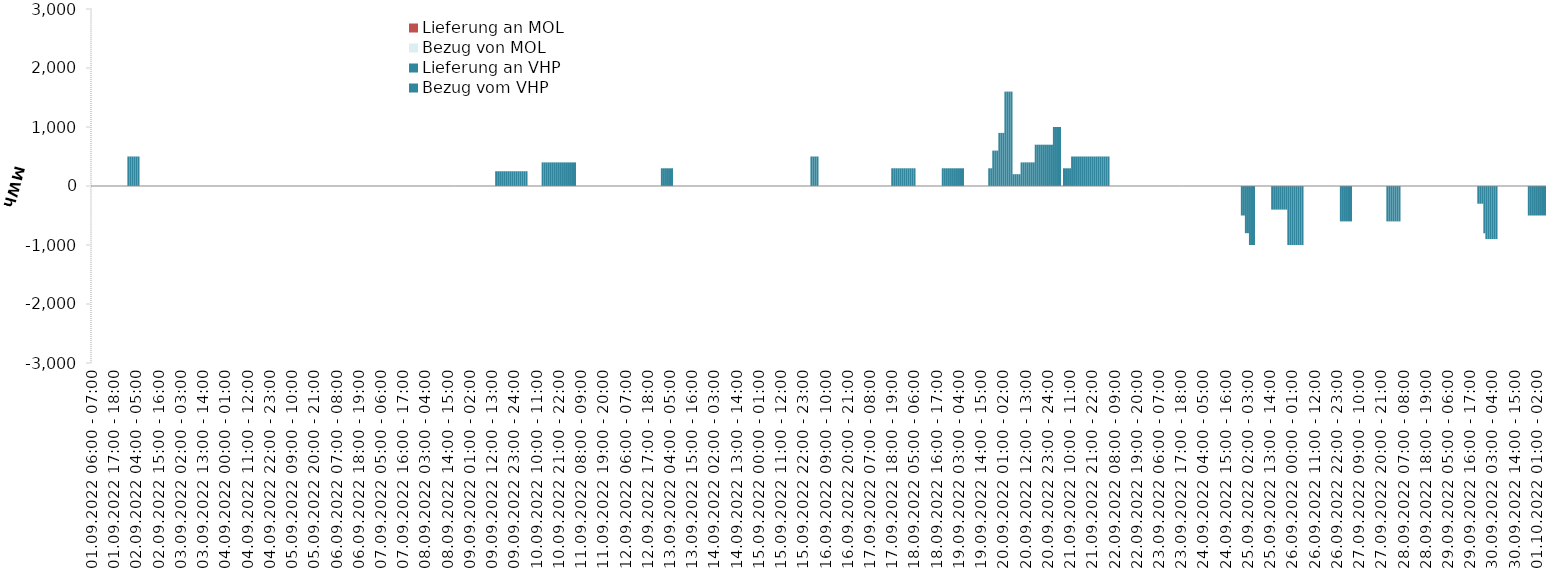
| Category | Bezug vom VHP | Lieferung an VHP | Bezug von MOL | Lieferung an MOL |
|---|---|---|---|---|
| 01.09.2022 06:00 - 07:00 | 0 | 0 | 0 | 0 |
| 01.09.2022 07:00 - 08:00 | 0 | 0 | 0 | 0 |
| 01.09.2022 08:00 - 09:00 | 0 | 0 | 0 | 0 |
| 01.09.2022 09:00 - 10:00 | 0 | 0 | 0 | 0 |
| 01.09.2022 10:00 - 11:00 | 0 | 0 | 0 | 0 |
| 01.09.2022 11:00 - 12:00 | 0 | 0 | 0 | 0 |
| 01.09.2022 12:00 - 13:00 | 0 | 0 | 0 | 0 |
| 01.09.2022 13:00 - 14:00 | 0 | 0 | 0 | 0 |
| 01.09.2022 14:00 - 15:00 | 0 | 0 | 0 | 0 |
| 01.09.2022 15:00 - 16:00 | 0 | 0 | 0 | 0 |
| 01.09.2022 16:00 - 17:00 | 0 | 0 | 0 | 0 |
| 01.09.2022 17:00 - 18:00 | 0 | 0 | 0 | 0 |
| 01.09.2022 18:00 - 19:00 | 0 | 0 | 0 | 0 |
| 01.09.2022 19:00 - 20:00 | 0 | 0 | 0 | 0 |
| 01.09.2022 20:00 - 21:00 | 0 | 0 | 0 | 0 |
| 01.09.2022 21:00 - 22:00 | 0 | 0 | 0 | 0 |
| 01.09.2022 22:00 - 23:00 | 0 | 0 | 0 | 0 |
| 01.09.2022 23:00 - 24:00 | 0 | 0 | 0 | 0 |
| 02.09.2022 00:00 - 01:00 | 500 | 0 | 0 | 0 |
| 02.09.2022 01:00 - 02:00 | 500 | 0 | 0 | 0 |
| 02.09.2022 02:00 - 03:00 | 500 | 0 | 0 | 0 |
| 02.09.2022 03:00 - 04:00 | 500 | 0 | 0 | 0 |
| 02.09.2022 04:00 - 05:00 | 500 | 0 | 0 | 0 |
| 02.09.2022 05:00 - 06:00 | 500 | 0 | 0 | 0 |
| 02.09.2022 06:00 - 07:00 | 0 | 0 | 0 | 0 |
| 02.09.2022 07:00 - 08:00 | 0 | 0 | 0 | 0 |
| 02.09.2022 08:00 - 09:00 | 0 | 0 | 0 | 0 |
| 02.09.2022 09:00 - 10:00 | 0 | 0 | 0 | 0 |
| 02.09.2022 10:00 - 11:00 | 0 | 0 | 0 | 0 |
| 02.09.2022 11:00 - 12:00 | 0 | 0 | 0 | 0 |
| 02.09.2022 12:00 - 13:00 | 0 | 0 | 0 | 0 |
| 02.09.2022 13:00 - 14:00 | 0 | 0 | 0 | 0 |
| 02.09.2022 14:00 - 15:00 | 0 | 0 | 0 | 0 |
| 02.09.2022 15:00 - 16:00 | 0 | 0 | 0 | 0 |
| 02.09.2022 16:00 - 17:00 | 0 | 0 | 0 | 0 |
| 02.09.2022 17:00 - 18:00 | 0 | 0 | 0 | 0 |
| 02.09.2022 18:00 - 19:00 | 0 | 0 | 0 | 0 |
| 02.09.2022 19:00 - 20:00 | 0 | 0 | 0 | 0 |
| 02.09.2022 20:00 - 21:00 | 0 | 0 | 0 | 0 |
| 02.09.2022 21:00 - 22:00 | 0 | 0 | 0 | 0 |
| 02.09.2022 22:00 - 23:00 | 0 | 0 | 0 | 0 |
| 02.09.2022 23:00 - 24:00 | 0 | 0 | 0 | 0 |
| 03.09.2022 00:00 - 01:00 | 0 | 0 | 0 | 0 |
| 03.09.2022 01:00 - 02:00 | 0 | 0 | 0 | 0 |
| 03.09.2022 02:00 - 03:00 | 0 | 0 | 0 | 0 |
| 03.09.2022 03:00 - 04:00 | 0 | 0 | 0 | 0 |
| 03.09.2022 04:00 - 05:00 | 0 | 0 | 0 | 0 |
| 03.09.2022 05:00 - 06:00 | 0 | 0 | 0 | 0 |
| 03.09.2022 06:00 - 07:00 | 0 | 0 | 0 | 0 |
| 03.09.2022 07:00 - 08:00 | 0 | 0 | 0 | 0 |
| 03.09.2022 08:00 - 09:00 | 0 | 0 | 0 | 0 |
| 03.09.2022 09:00 - 10:00 | 0 | 0 | 0 | 0 |
| 03.09.2022 10:00 - 11:00 | 0 | 0 | 0 | 0 |
| 03.09.2022 11:00 - 12:00 | 0 | 0 | 0 | 0 |
| 03.09.2022 12:00 - 13:00 | 0 | 0 | 0 | 0 |
| 03.09.2022 13:00 - 14:00 | 0 | 0 | 0 | 0 |
| 03.09.2022 14:00 - 15:00 | 0 | 0 | 0 | 0 |
| 03.09.2022 15:00 - 16:00 | 0 | 0 | 0 | 0 |
| 03.09.2022 16:00 - 17:00 | 0 | 0 | 0 | 0 |
| 03.09.2022 17:00 - 18:00 | 0 | 0 | 0 | 0 |
| 03.09.2022 18:00 - 19:00 | 0 | 0 | 0 | 0 |
| 03.09.2022 19:00 - 20:00 | 0 | 0 | 0 | 0 |
| 03.09.2022 20:00 - 21:00 | 0 | 0 | 0 | 0 |
| 03.09.2022 21:00 - 22:00 | 0 | 0 | 0 | 0 |
| 03.09.2022 22:00 - 23:00 | 0 | 0 | 0 | 0 |
| 03.09.2022 23:00 - 24:00 | 0 | 0 | 0 | 0 |
| 04.09.2022 00:00 - 01:00 | 0 | 0 | 0 | 0 |
| 04.09.2022 01:00 - 02:00 | 0 | 0 | 0 | 0 |
| 04.09.2022 02:00 - 03:00 | 0 | 0 | 0 | 0 |
| 04.09.2022 03:00 - 04:00 | 0 | 0 | 0 | 0 |
| 04.09.2022 04:00 - 05:00 | 0 | 0 | 0 | 0 |
| 04.09.2022 05:00 - 06:00 | 0 | 0 | 0 | 0 |
| 04.09.2022 06:00 - 07:00 | 0 | 0 | 0 | 0 |
| 04.09.2022 07:00 - 08:00 | 0 | 0 | 0 | 0 |
| 04.09.2022 08:00 - 09:00 | 0 | 0 | 0 | 0 |
| 04.09.2022 09:00 - 10:00 | 0 | 0 | 0 | 0 |
| 04.09.2022 10:00 - 11:00 | 0 | 0 | 0 | 0 |
| 04.09.2022 11:00 - 12:00 | 0 | 0 | 0 | 0 |
| 04.09.2022 12:00 - 13:00 | 0 | 0 | 0 | 0 |
| 04.09.2022 13:00 - 14:00 | 0 | 0 | 0 | 0 |
| 04.09.2022 14:00 - 15:00 | 0 | 0 | 0 | 0 |
| 04.09.2022 15:00 - 16:00 | 0 | 0 | 0 | 0 |
| 04.09.2022 16:00 - 17:00 | 0 | 0 | 0 | 0 |
| 04.09.2022 17:00 - 18:00 | 0 | 0 | 0 | 0 |
| 04.09.2022 18:00 - 19:00 | 0 | 0 | 0 | 0 |
| 04.09.2022 19:00 - 20:00 | 0 | 0 | 0 | 0 |
| 04.09.2022 20:00 - 21:00 | 0 | 0 | 0 | 0 |
| 04.09.2022 21:00 - 22:00 | 0 | 0 | 0 | 0 |
| 04.09.2022 22:00 - 23:00 | 0 | 0 | 0 | 0 |
| 04.09.2022 23:00 - 24:00 | 0 | 0 | 0 | 0 |
| 05.09.2022 00:00 - 01:00 | 0 | 0 | 0 | 0 |
| 05.09.2022 01:00 - 02:00 | 0 | 0 | 0 | 0 |
| 05.09.2022 02:00 - 03:00 | 0 | 0 | 0 | 0 |
| 05.09.2022 03:00 - 04:00 | 0 | 0 | 0 | 0 |
| 05.09.2022 04:00 - 05:00 | 0 | 0 | 0 | 0 |
| 05.09.2022 05:00 - 06:00 | 0 | 0 | 0 | 0 |
| 05.09.2022 06:00 - 07:00 | 0 | 0 | 0 | 0 |
| 05.09.2022 07:00 - 08:00 | 0 | 0 | 0 | 0 |
| 05.09.2022 08:00 - 09:00 | 0 | 0 | 0 | 0 |
| 05.09.2022 09:00 - 10:00 | 0 | 0 | 0 | 0 |
| 05.09.2022 10:00 - 11:00 | 0 | 0 | 0 | 0 |
| 05.09.2022 11:00 - 12:00 | 0 | 0 | 0 | 0 |
| 05.09.2022 12:00 - 13:00 | 0 | 0 | 0 | 0 |
| 05.09.2022 13:00 - 14:00 | 0 | 0 | 0 | 0 |
| 05.09.2022 14:00 - 15:00 | 0 | 0 | 0 | 0 |
| 05.09.2022 15:00 - 16:00 | 0 | 0 | 0 | 0 |
| 05.09.2022 16:00 - 17:00 | 0 | 0 | 0 | 0 |
| 05.09.2022 17:00 - 18:00 | 0 | 0 | 0 | 0 |
| 05.09.2022 18:00 - 19:00 | 0 | 0 | 0 | 0 |
| 05.09.2022 19:00 - 20:00 | 0 | 0 | 0 | 0 |
| 05.09.2022 20:00 - 21:00 | 0 | 0 | 0 | 0 |
| 05.09.2022 21:00 - 22:00 | 0 | 0 | 0 | 0 |
| 05.09.2022 22:00 - 23:00 | 0 | 0 | 0 | 0 |
| 05.09.2022 23:00 - 24:00 | 0 | 0 | 0 | 0 |
| 06.09.2022 00:00 - 01:00 | 0 | 0 | 0 | 0 |
| 06.09.2022 01:00 - 02:00 | 0 | 0 | 0 | 0 |
| 06.09.2022 02:00 - 03:00 | 0 | 0 | 0 | 0 |
| 06.09.2022 03:00 - 04:00 | 0 | 0 | 0 | 0 |
| 06.09.2022 04:00 - 05:00 | 0 | 0 | 0 | 0 |
| 06.09.2022 05:00 - 06:00 | 0 | 0 | 0 | 0 |
| 06.09.2022 06:00 - 07:00 | 0 | 0 | 0 | 0 |
| 06.09.2022 07:00 - 08:00 | 0 | 0 | 0 | 0 |
| 06.09.2022 08:00 - 09:00 | 0 | 0 | 0 | 0 |
| 06.09.2022 09:00 - 10:00 | 0 | 0 | 0 | 0 |
| 06.09.2022 10:00 - 11:00 | 0 | 0 | 0 | 0 |
| 06.09.2022 11:00 - 12:00 | 0 | 0 | 0 | 0 |
| 06.09.2022 12:00 - 13:00 | 0 | 0 | 0 | 0 |
| 06.09.2022 13:00 - 14:00 | 0 | 0 | 0 | 0 |
| 06.09.2022 14:00 - 15:00 | 0 | 0 | 0 | 0 |
| 06.09.2022 15:00 - 16:00 | 0 | 0 | 0 | 0 |
| 06.09.2022 16:00 - 17:00 | 0 | 0 | 0 | 0 |
| 06.09.2022 17:00 - 18:00 | 0 | 0 | 0 | 0 |
| 06.09.2022 18:00 - 19:00 | 0 | 0 | 0 | 0 |
| 06.09.2022 19:00 - 20:00 | 0 | 0 | 0 | 0 |
| 06.09.2022 20:00 - 21:00 | 0 | 0 | 0 | 0 |
| 06.09.2022 21:00 - 22:00 | 0 | 0 | 0 | 0 |
| 06.09.2022 22:00 - 23:00 | 0 | 0 | 0 | 0 |
| 06.09.2022 23:00 - 24:00 | 0 | 0 | 0 | 0 |
| 07.09.2022 00:00 - 01:00 | 0 | 0 | 0 | 0 |
| 07.09.2022 01:00 - 02:00 | 0 | 0 | 0 | 0 |
| 07.09.2022 02:00 - 03:00 | 0 | 0 | 0 | 0 |
| 07.09.2022 03:00 - 04:00 | 0 | 0 | 0 | 0 |
| 07.09.2022 04:00 - 05:00 | 0 | 0 | 0 | 0 |
| 07.09.2022 05:00 - 06:00 | 0 | 0 | 0 | 0 |
| 07.09.2022 06:00 - 07:00 | 0 | 0 | 0 | 0 |
| 07.09.2022 07:00 - 08:00 | 0 | 0 | 0 | 0 |
| 07.09.2022 08:00 - 09:00 | 0 | 0 | 0 | 0 |
| 07.09.2022 09:00 - 10:00 | 0 | 0 | 0 | 0 |
| 07.09.2022 10:00 - 11:00 | 0 | 0 | 0 | 0 |
| 07.09.2022 11:00 - 12:00 | 0 | 0 | 0 | 0 |
| 07.09.2022 12:00 - 13:00 | 0 | 0 | 0 | 0 |
| 07.09.2022 13:00 - 14:00 | 0 | 0 | 0 | 0 |
| 07.09.2022 14:00 - 15:00 | 0 | 0 | 0 | 0 |
| 07.09.2022 15:00 - 16:00 | 0 | 0 | 0 | 0 |
| 07.09.2022 16:00 - 17:00 | 0 | 0 | 0 | 0 |
| 07.09.2022 17:00 - 18:00 | 0 | 0 | 0 | 0 |
| 07.09.2022 18:00 - 19:00 | 0 | 0 | 0 | 0 |
| 07.09.2022 19:00 - 20:00 | 0 | 0 | 0 | 0 |
| 07.09.2022 20:00 - 21:00 | 0 | 0 | 0 | 0 |
| 07.09.2022 21:00 - 22:00 | 0 | 0 | 0 | 0 |
| 07.09.2022 22:00 - 23:00 | 0 | 0 | 0 | 0 |
| 07.09.2022 23:00 - 24:00 | 0 | 0 | 0 | 0 |
| 08.09.2022 00:00 - 01:00 | 0 | 0 | 0 | 0 |
| 08.09.2022 01:00 - 02:00 | 0 | 0 | 0 | 0 |
| 08.09.2022 02:00 - 03:00 | 0 | 0 | 0 | 0 |
| 08.09.2022 03:00 - 04:00 | 0 | 0 | 0 | 0 |
| 08.09.2022 04:00 - 05:00 | 0 | 0 | 0 | 0 |
| 08.09.2022 05:00 - 06:00 | 0 | 0 | 0 | 0 |
| 08.09.2022 06:00 - 07:00 | 0 | 0 | 0 | 0 |
| 08.09.2022 07:00 - 08:00 | 0 | 0 | 0 | 0 |
| 08.09.2022 08:00 - 09:00 | 0 | 0 | 0 | 0 |
| 08.09.2022 09:00 - 10:00 | 0 | 0 | 0 | 0 |
| 08.09.2022 10:00 - 11:00 | 0 | 0 | 0 | 0 |
| 08.09.2022 11:00 - 12:00 | 0 | 0 | 0 | 0 |
| 08.09.2022 12:00 - 13:00 | 0 | 0 | 0 | 0 |
| 08.09.2022 13:00 - 14:00 | 0 | 0 | 0 | 0 |
| 08.09.2022 14:00 - 15:00 | 0 | 0 | 0 | 0 |
| 08.09.2022 15:00 - 16:00 | 0 | 0 | 0 | 0 |
| 08.09.2022 16:00 - 17:00 | 0 | 0 | 0 | 0 |
| 08.09.2022 17:00 - 18:00 | 0 | 0 | 0 | 0 |
| 08.09.2022 18:00 - 19:00 | 0 | 0 | 0 | 0 |
| 08.09.2022 19:00 - 20:00 | 0 | 0 | 0 | 0 |
| 08.09.2022 20:00 - 21:00 | 0 | 0 | 0 | 0 |
| 08.09.2022 21:00 - 22:00 | 0 | 0 | 0 | 0 |
| 08.09.2022 22:00 - 23:00 | 0 | 0 | 0 | 0 |
| 08.09.2022 23:00 - 24:00 | 0 | 0 | 0 | 0 |
| 09.09.2022 00:00 - 01:00 | 0 | 0 | 0 | 0 |
| 09.09.2022 01:00 - 02:00 | 0 | 0 | 0 | 0 |
| 09.09.2022 02:00 - 03:00 | 0 | 0 | 0 | 0 |
| 09.09.2022 03:00 - 04:00 | 0 | 0 | 0 | 0 |
| 09.09.2022 04:00 - 05:00 | 0 | 0 | 0 | 0 |
| 09.09.2022 05:00 - 06:00 | 0 | 0 | 0 | 0 |
| 09.09.2022 06:00 - 07:00 | 0 | 0 | 0 | 0 |
| 09.09.2022 07:00 - 08:00 | 0 | 0 | 0 | 0 |
| 09.09.2022 08:00 - 09:00 | 0 | 0 | 0 | 0 |
| 09.09.2022 09:00 - 10:00 | 0 | 0 | 0 | 0 |
| 09.09.2022 10:00 - 11:00 | 0 | 0 | 0 | 0 |
| 09.09.2022 11:00 - 12:00 | 0 | 0 | 0 | 0 |
| 09.09.2022 12:00 - 13:00 | 0 | 0 | 0 | 0 |
| 09.09.2022 13:00 - 14:00 | 0 | 0 | 0 | 0 |
| 09.09.2022 14:00 - 15:00 | 250 | 0 | 0 | 0 |
| 09.09.2022 15:00 - 16:00 | 250 | 0 | 0 | 0 |
| 09.09.2022 16:00 - 17:00 | 250 | 0 | 0 | 0 |
| 09.09.2022 17:00 - 18:00 | 250 | 0 | 0 | 0 |
| 09.09.2022 18:00 - 19:00 | 250 | 0 | 0 | 0 |
| 09.09.2022 19:00 - 20:00 | 250 | 0 | 0 | 0 |
| 09.09.2022 20:00 - 21:00 | 250 | 0 | 0 | 0 |
| 09.09.2022 21:00 - 22:00 | 250 | 0 | 0 | 0 |
| 09.09.2022 22:00 - 23:00 | 250 | 0 | 0 | 0 |
| 09.09.2022 23:00 - 24:00 | 250 | 0 | 0 | 0 |
| 10.09.2022 00:00 - 01:00 | 250 | 0 | 0 | 0 |
| 10.09.2022 01:00 - 02:00 | 250 | 0 | 0 | 0 |
| 10.09.2022 02:00 - 03:00 | 250 | 0 | 0 | 0 |
| 10.09.2022 03:00 - 04:00 | 250 | 0 | 0 | 0 |
| 10.09.2022 04:00 - 05:00 | 250 | 0 | 0 | 0 |
| 10.09.2022 05:00 - 06:00 | 250 | 0 | 0 | 0 |
| 10.09.2022 06:00 - 07:00 | 0 | 0 | 0 | 0 |
| 10.09.2022 07:00 - 08:00 | 0 | 0 | 0 | 0 |
| 10.09.2022 08:00 - 09:00 | 0 | 0 | 0 | 0 |
| 10.09.2022 09:00 - 10:00 | 0 | 0 | 0 | 0 |
| 10.09.2022 10:00 - 11:00 | 0 | 0 | 0 | 0 |
| 10.09.2022 11:00 - 12:00 | 0 | 0 | 0 | 0 |
| 10.09.2022 12:00 - 13:00 | 0 | 0 | 0 | 0 |
| 10.09.2022 13:00 - 14:00 | 400 | 0 | 0 | 0 |
| 10.09.2022 14:00 - 15:00 | 400 | 0 | 0 | 0 |
| 10.09.2022 15:00 - 16:00 | 400 | 0 | 0 | 0 |
| 10.09.2022 16:00 - 17:00 | 400 | 0 | 0 | 0 |
| 10.09.2022 17:00 - 18:00 | 400 | 0 | 0 | 0 |
| 10.09.2022 18:00 - 19:00 | 400 | 0 | 0 | 0 |
| 10.09.2022 19:00 - 20:00 | 400 | 0 | 0 | 0 |
| 10.09.2022 20:00 - 21:00 | 400 | 0 | 0 | 0 |
| 10.09.2022 21:00 - 22:00 | 400 | 0 | 0 | 0 |
| 10.09.2022 22:00 - 23:00 | 400 | 0 | 0 | 0 |
| 10.09.2022 23:00 - 24:00 | 400 | 0 | 0 | 0 |
| 11.09.2022 00:00 - 01:00 | 400 | 0 | 0 | 0 |
| 11.09.2022 01:00 - 02:00 | 400 | 0 | 0 | 0 |
| 11.09.2022 02:00 - 03:00 | 400 | 0 | 0 | 0 |
| 11.09.2022 03:00 - 04:00 | 400 | 0 | 0 | 0 |
| 11.09.2022 04:00 - 05:00 | 400 | 0 | 0 | 0 |
| 11.09.2022 05:00 - 06:00 | 400 | 0 | 0 | 0 |
| 11.09.2022 06:00 - 07:00 | 0 | 0 | 0 | 0 |
| 11.09.2022 07:00 - 08:00 | 0 | 0 | 0 | 0 |
| 11.09.2022 08:00 - 09:00 | 0 | 0 | 0 | 0 |
| 11.09.2022 09:00 - 10:00 | 0 | 0 | 0 | 0 |
| 11.09.2022 10:00 - 11:00 | 0 | 0 | 0 | 0 |
| 11.09.2022 11:00 - 12:00 | 0 | 0 | 0 | 0 |
| 11.09.2022 12:00 - 13:00 | 0 | 0 | 0 | 0 |
| 11.09.2022 13:00 - 14:00 | 0 | 0 | 0 | 0 |
| 11.09.2022 14:00 - 15:00 | 0 | 0 | 0 | 0 |
| 11.09.2022 15:00 - 16:00 | 0 | 0 | 0 | 0 |
| 11.09.2022 16:00 - 17:00 | 0 | 0 | 0 | 0 |
| 11.09.2022 17:00 - 18:00 | 0 | 0 | 0 | 0 |
| 11.09.2022 18:00 - 19:00 | 0 | 0 | 0 | 0 |
| 11.09.2022 19:00 - 20:00 | 0 | 0 | 0 | 0 |
| 11.09.2022 20:00 - 21:00 | 0 | 0 | 0 | 0 |
| 11.09.2022 21:00 - 22:00 | 0 | 0 | 0 | 0 |
| 11.09.2022 22:00 - 23:00 | 0 | 0 | 0 | 0 |
| 11.09.2022 23:00 - 24:00 | 0 | 0 | 0 | 0 |
| 12.09.2022 00:00 - 01:00 | 0 | 0 | 0 | 0 |
| 12.09.2022 01:00 - 02:00 | 0 | 0 | 0 | 0 |
| 12.09.2022 02:00 - 03:00 | 0 | 0 | 0 | 0 |
| 12.09.2022 03:00 - 04:00 | 0 | 0 | 0 | 0 |
| 12.09.2022 04:00 - 05:00 | 0 | 0 | 0 | 0 |
| 12.09.2022 05:00 - 06:00 | 0 | 0 | 0 | 0 |
| 12.09.2022 06:00 - 07:00 | 0 | 0 | 0 | 0 |
| 12.09.2022 07:00 - 08:00 | 0 | 0 | 0 | 0 |
| 12.09.2022 08:00 - 09:00 | 0 | 0 | 0 | 0 |
| 12.09.2022 09:00 - 10:00 | 0 | 0 | 0 | 0 |
| 12.09.2022 10:00 - 11:00 | 0 | 0 | 0 | 0 |
| 12.09.2022 11:00 - 12:00 | 0 | 0 | 0 | 0 |
| 12.09.2022 12:00 - 13:00 | 0 | 0 | 0 | 0 |
| 12.09.2022 13:00 - 14:00 | 0 | 0 | 0 | 0 |
| 12.09.2022 14:00 - 15:00 | 0 | 0 | 0 | 0 |
| 12.09.2022 15:00 - 16:00 | 0 | 0 | 0 | 0 |
| 12.09.2022 16:00 - 17:00 | 0 | 0 | 0 | 0 |
| 12.09.2022 17:00 - 18:00 | 0 | 0 | 0 | 0 |
| 12.09.2022 18:00 - 19:00 | 0 | 0 | 0 | 0 |
| 12.09.2022 19:00 - 20:00 | 0 | 0 | 0 | 0 |
| 12.09.2022 20:00 - 21:00 | 0 | 0 | 0 | 0 |
| 12.09.2022 21:00 - 22:00 | 0 | 0 | 0 | 0 |
| 12.09.2022 22:00 - 23:00 | 0 | 0 | 0 | 0 |
| 12.09.2022 23:00 - 24:00 | 0 | 0 | 0 | 0 |
| 13.09.2022 00:00 - 01:00 | 300 | 0 | 0 | 0 |
| 13.09.2022 01:00 - 02:00 | 300 | 0 | 0 | 0 |
| 13.09.2022 02:00 - 03:00 | 300 | 0 | 0 | 0 |
| 13.09.2022 03:00 - 04:00 | 300 | 0 | 0 | 0 |
| 13.09.2022 04:00 - 05:00 | 300 | 0 | 0 | 0 |
| 13.09.2022 05:00 - 06:00 | 300 | 0 | 0 | 0 |
| 13.09.2022 06:00 - 07:00 | 0 | 0 | 0 | 0 |
| 13.09.2022 07:00 - 08:00 | 0 | 0 | 0 | 0 |
| 13.09.2022 08:00 - 09:00 | 0 | 0 | 0 | 0 |
| 13.09.2022 09:00 - 10:00 | 0 | 0 | 0 | 0 |
| 13.09.2022 10:00 - 11:00 | 0 | 0 | 0 | 0 |
| 13.09.2022 11:00 - 12:00 | 0 | 0 | 0 | 0 |
| 13.09.2022 12:00 - 13:00 | 0 | 0 | 0 | 0 |
| 13.09.2022 13:00 - 14:00 | 0 | 0 | 0 | 0 |
| 13.09.2022 14:00 - 15:00 | 0 | 0 | 0 | 0 |
| 13.09.2022 15:00 - 16:00 | 0 | 0 | 0 | 0 |
| 13.09.2022 16:00 - 17:00 | 0 | 0 | 0 | 0 |
| 13.09.2022 17:00 - 18:00 | 0 | 0 | 0 | 0 |
| 13.09.2022 18:00 - 19:00 | 0 | 0 | 0 | 0 |
| 13.09.2022 19:00 - 20:00 | 0 | 0 | 0 | 0 |
| 13.09.2022 20:00 - 21:00 | 0 | 0 | 0 | 0 |
| 13.09.2022 21:00 - 22:00 | 0 | 0 | 0 | 0 |
| 13.09.2022 22:00 - 23:00 | 0 | 0 | 0 | 0 |
| 13.09.2022 23:00 - 24:00 | 0 | 0 | 0 | 0 |
| 14.09.2022 00:00 - 01:00 | 0 | 0 | 0 | 0 |
| 14.09.2022 01:00 - 02:00 | 0 | 0 | 0 | 0 |
| 14.09.2022 02:00 - 03:00 | 0 | 0 | 0 | 0 |
| 14.09.2022 03:00 - 04:00 | 0 | 0 | 0 | 0 |
| 14.09.2022 04:00 - 05:00 | 0 | 0 | 0 | 0 |
| 14.09.2022 05:00 - 06:00 | 0 | 0 | 0 | 0 |
| 14.09.2022 06:00 - 07:00 | 0 | 0 | 0 | 0 |
| 14.09.2022 07:00 - 08:00 | 0 | 0 | 0 | 0 |
| 14.09.2022 08:00 - 09:00 | 0 | 0 | 0 | 0 |
| 14.09.2022 09:00 - 10:00 | 0 | 0 | 0 | 0 |
| 14.09.2022 10:00 - 11:00 | 0 | 0 | 0 | 0 |
| 14.09.2022 11:00 - 12:00 | 0 | 0 | 0 | 0 |
| 14.09.2022 12:00 - 13:00 | 0 | 0 | 0 | 0 |
| 14.09.2022 13:00 - 14:00 | 0 | 0 | 0 | 0 |
| 14.09.2022 14:00 - 15:00 | 0 | 0 | 0 | 0 |
| 14.09.2022 15:00 - 16:00 | 0 | 0 | 0 | 0 |
| 14.09.2022 16:00 - 17:00 | 0 | 0 | 0 | 0 |
| 14.09.2022 17:00 - 18:00 | 0 | 0 | 0 | 0 |
| 14.09.2022 18:00 - 19:00 | 0 | 0 | 0 | 0 |
| 14.09.2022 19:00 - 20:00 | 0 | 0 | 0 | 0 |
| 14.09.2022 20:00 - 21:00 | 0 | 0 | 0 | 0 |
| 14.09.2022 21:00 - 22:00 | 0 | 0 | 0 | 0 |
| 14.09.2022 22:00 - 23:00 | 0 | 0 | 0 | 0 |
| 14.09.2022 23:00 - 24:00 | 0 | 0 | 0 | 0 |
| 15.09.2022 00:00 - 01:00 | 0 | 0 | 0 | 0 |
| 15.09.2022 01:00 - 02:00 | 0 | 0 | 0 | 0 |
| 15.09.2022 02:00 - 03:00 | 0 | 0 | 0 | 0 |
| 15.09.2022 03:00 - 04:00 | 0 | 0 | 0 | 0 |
| 15.09.2022 04:00 - 05:00 | 0 | 0 | 0 | 0 |
| 15.09.2022 05:00 - 06:00 | 0 | 0 | 0 | 0 |
| 15.09.2022 06:00 - 07:00 | 0 | 0 | 0 | 0 |
| 15.09.2022 07:00 - 08:00 | 0 | 0 | 0 | 0 |
| 15.09.2022 08:00 - 09:00 | 0 | 0 | 0 | 0 |
| 15.09.2022 09:00 - 10:00 | 0 | 0 | 0 | 0 |
| 15.09.2022 10:00 - 11:00 | 0 | 0 | 0 | 0 |
| 15.09.2022 11:00 - 12:00 | 0 | 0 | 0 | 0 |
| 15.09.2022 12:00 - 13:00 | 0 | 0 | 0 | 0 |
| 15.09.2022 13:00 - 14:00 | 0 | 0 | 0 | 0 |
| 15.09.2022 14:00 - 15:00 | 0 | 0 | 0 | 0 |
| 15.09.2022 15:00 - 16:00 | 0 | 0 | 0 | 0 |
| 15.09.2022 16:00 - 17:00 | 0 | 0 | 0 | 0 |
| 15.09.2022 17:00 - 18:00 | 0 | 0 | 0 | 0 |
| 15.09.2022 18:00 - 19:00 | 0 | 0 | 0 | 0 |
| 15.09.2022 19:00 - 20:00 | 0 | 0 | 0 | 0 |
| 15.09.2022 20:00 - 21:00 | 0 | 0 | 0 | 0 |
| 15.09.2022 21:00 - 22:00 | 0 | 0 | 0 | 0 |
| 15.09.2022 22:00 - 23:00 | 0 | 0 | 0 | 0 |
| 15.09.2022 23:00 - 24:00 | 0 | 0 | 0 | 0 |
| 16.09.2022 00:00 - 01:00 | 0 | 0 | 0 | 0 |
| 16.09.2022 01:00 - 02:00 | 0 | 0 | 0 | 0 |
| 16.09.2022 02:00 - 03:00 | 500 | 0 | 0 | 0 |
| 16.09.2022 03:00 - 04:00 | 500 | 0 | 0 | 0 |
| 16.09.2022 04:00 - 05:00 | 500 | 0 | 0 | 0 |
| 16.09.2022 05:00 - 06:00 | 500 | 0 | 0 | 0 |
| 16.09.2022 06:00 - 07:00 | 0 | 0 | 0 | 0 |
| 16.09.2022 07:00 - 08:00 | 0 | 0 | 0 | 0 |
| 16.09.2022 08:00 - 09:00 | 0 | 0 | 0 | 0 |
| 16.09.2022 09:00 - 10:00 | 0 | 0 | 0 | 0 |
| 16.09.2022 10:00 - 11:00 | 0 | 0 | 0 | 0 |
| 16.09.2022 11:00 - 12:00 | 0 | 0 | 0 | 0 |
| 16.09.2022 12:00 - 13:00 | 0 | 0 | 0 | 0 |
| 16.09.2022 13:00 - 14:00 | 0 | 0 | 0 | 0 |
| 16.09.2022 14:00 - 15:00 | 0 | 0 | 0 | 0 |
| 16.09.2022 15:00 - 16:00 | 0 | 0 | 0 | 0 |
| 16.09.2022 16:00 - 17:00 | 0 | 0 | 0 | 0 |
| 16.09.2022 17:00 - 18:00 | 0 | 0 | 0 | 0 |
| 16.09.2022 18:00 - 19:00 | 0 | 0 | 0 | 0 |
| 16.09.2022 19:00 - 20:00 | 0 | 0 | 0 | 0 |
| 16.09.2022 20:00 - 21:00 | 0 | 0 | 0 | 0 |
| 16.09.2022 21:00 - 22:00 | 0 | 0 | 0 | 0 |
| 16.09.2022 22:00 - 23:00 | 0 | 0 | 0 | 0 |
| 16.09.2022 23:00 - 24:00 | 0 | 0 | 0 | 0 |
| 17.09.2022 00:00 - 01:00 | 0 | 0 | 0 | 0 |
| 17.09.2022 01:00 - 02:00 | 0 | 0 | 0 | 0 |
| 17.09.2022 02:00 - 03:00 | 0 | 0 | 0 | 0 |
| 17.09.2022 03:00 - 04:00 | 0 | 0 | 0 | 0 |
| 17.09.2022 04:00 - 05:00 | 0 | 0 | 0 | 0 |
| 17.09.2022 05:00 - 06:00 | 0 | 0 | 0 | 0 |
| 17.09.2022 06:00 - 07:00 | 0 | 0 | 0 | 0 |
| 17.09.2022 07:00 - 08:00 | 0 | 0 | 0 | 0 |
| 17.09.2022 08:00 - 09:00 | 0 | 0 | 0 | 0 |
| 17.09.2022 09:00 - 10:00 | 0 | 0 | 0 | 0 |
| 17.09.2022 10:00 - 11:00 | 0 | 0 | 0 | 0 |
| 17.09.2022 11:00 - 12:00 | 0 | 0 | 0 | 0 |
| 17.09.2022 12:00 - 13:00 | 0 | 0 | 0 | 0 |
| 17.09.2022 13:00 - 14:00 | 0 | 0 | 0 | 0 |
| 17.09.2022 14:00 - 15:00 | 0 | 0 | 0 | 0 |
| 17.09.2022 15:00 - 16:00 | 0 | 0 | 0 | 0 |
| 17.09.2022 16:00 - 17:00 | 0 | 0 | 0 | 0 |
| 17.09.2022 17:00 - 18:00 | 0 | 0 | 0 | 0 |
| 17.09.2022 18:00 - 19:00 | 300 | 0 | 0 | 0 |
| 17.09.2022 19:00 - 20:00 | 300 | 0 | 0 | 0 |
| 17.09.2022 20:00 - 21:00 | 300 | 0 | 0 | 0 |
| 17.09.2022 21:00 - 22:00 | 300 | 0 | 0 | 0 |
| 17.09.2022 22:00 - 23:00 | 300 | 0 | 0 | 0 |
| 17.09.2022 23:00 - 24:00 | 300 | 0 | 0 | 0 |
| 18.09.2022 00:00 - 01:00 | 300 | 0 | 0 | 0 |
| 18.09.2022 01:00 - 02:00 | 300 | 0 | 0 | 0 |
| 18.09.2022 02:00 - 03:00 | 300 | 0 | 0 | 0 |
| 18.09.2022 03:00 - 04:00 | 300 | 0 | 0 | 0 |
| 18.09.2022 04:00 - 05:00 | 300 | 0 | 0 | 0 |
| 18.09.2022 05:00 - 06:00 | 300 | 0 | 0 | 0 |
| 18.09.2022 06:00 - 07:00 | 0 | 0 | 0 | 0 |
| 18.09.2022 07:00 - 08:00 | 0 | 0 | 0 | 0 |
| 18.09.2022 08:00 - 09:00 | 0 | 0 | 0 | 0 |
| 18.09.2022 09:00 - 10:00 | 0 | 0 | 0 | 0 |
| 18.09.2022 10:00 - 11:00 | 0 | 0 | 0 | 0 |
| 18.09.2022 11:00 - 12:00 | 0 | 0 | 0 | 0 |
| 18.09.2022 12:00 - 13:00 | 0 | 0 | 0 | 0 |
| 18.09.2022 13:00 - 14:00 | 0 | 0 | 0 | 0 |
| 18.09.2022 14:00 - 15:00 | 0 | 0 | 0 | 0 |
| 18.09.2022 15:00 - 16:00 | 0 | 0 | 0 | 0 |
| 18.09.2022 16:00 - 17:00 | 0 | 0 | 0 | 0 |
| 18.09.2022 17:00 - 18:00 | 0 | 0 | 0 | 0 |
| 18.09.2022 18:00 - 19:00 | 0 | 0 | 0 | 0 |
| 18.09.2022 19:00 - 20:00 | 300 | 0 | 0 | 0 |
| 18.09.2022 20:00 - 21:00 | 300 | 0 | 0 | 0 |
| 18.09.2022 21:00 - 22:00 | 300 | 0 | 0 | 0 |
| 18.09.2022 22:00 - 23:00 | 300 | 0 | 0 | 0 |
| 18.09.2022 23:00 - 24:00 | 300 | 0 | 0 | 0 |
| 19.09.2022 00:00 - 01:00 | 300 | 0 | 0 | 0 |
| 19.09.2022 01:00 - 02:00 | 300 | 0 | 0 | 0 |
| 19.09.2022 02:00 - 03:00 | 300 | 0 | 0 | 0 |
| 19.09.2022 03:00 - 04:00 | 300 | 0 | 0 | 0 |
| 19.09.2022 04:00 - 05:00 | 300 | 0 | 0 | 0 |
| 19.09.2022 05:00 - 06:00 | 300 | 0 | 0 | 0 |
| 19.09.2022 06:00 - 07:00 | 0 | 0 | 0 | 0 |
| 19.09.2022 07:00 - 08:00 | 0 | 0 | 0 | 0 |
| 19.09.2022 08:00 - 09:00 | 0 | 0 | 0 | 0 |
| 19.09.2022 09:00 - 10:00 | 0 | 0 | 0 | 0 |
| 19.09.2022 10:00 - 11:00 | 0 | 0 | 0 | 0 |
| 19.09.2022 11:00 - 12:00 | 0 | 0 | 0 | 0 |
| 19.09.2022 12:00 - 13:00 | 0 | 0 | 0 | 0 |
| 19.09.2022 13:00 - 14:00 | 0 | 0 | 0 | 0 |
| 19.09.2022 14:00 - 15:00 | 0 | 0 | 0 | 0 |
| 19.09.2022 15:00 - 16:00 | 0 | 0 | 0 | 0 |
| 19.09.2022 16:00 - 17:00 | 0 | 0 | 0 | 0 |
| 19.09.2022 17:00 - 18:00 | 0 | 0 | 0 | 0 |
| 19.09.2022 18:00 - 19:00 | 300 | 0 | 0 | 0 |
| 19.09.2022 19:00 - 20:00 | 300 | 0 | 0 | 0 |
| 19.09.2022 20:00 - 21:00 | 600 | 0 | 0 | 0 |
| 19.09.2022 21:00 - 22:00 | 600 | 0 | 0 | 0 |
| 19.09.2022 22:00 - 23:00 | 600 | 0 | 0 | 0 |
| 19.09.2022 23:00 - 24:00 | 900 | 0 | 0 | 0 |
| 20.09.2022 00:00 - 01:00 | 900 | 0 | 0 | 0 |
| 20.09.2022 01:00 - 02:00 | 900 | 0 | 0 | 0 |
| 20.09.2022 02:00 - 03:00 | 1600 | 0 | 0 | 0 |
| 20.09.2022 03:00 - 04:00 | 1600 | 0 | 0 | 0 |
| 20.09.2022 04:00 - 05:00 | 1600 | 0 | 0 | 0 |
| 20.09.2022 05:00 - 06:00 | 1600 | 0 | 0 | 0 |
| 20.09.2022 06:00 - 07:00 | 200 | 0 | 0 | 0 |
| 20.09.2022 07:00 - 08:00 | 200 | 0 | 0 | 0 |
| 20.09.2022 08:00 - 09:00 | 200 | 0 | 0 | 0 |
| 20.09.2022 09:00 - 10:00 | 200 | 0 | 0 | 0 |
| 20.09.2022 10:00 - 11:00 | 400 | 0 | 0 | 0 |
| 20.09.2022 11:00 - 12:00 | 400 | 0 | 0 | 0 |
| 20.09.2022 12:00 - 13:00 | 400 | 0 | 0 | 0 |
| 20.09.2022 13:00 - 14:00 | 400 | 0 | 0 | 0 |
| 20.09.2022 14:00 - 15:00 | 400 | 0 | 0 | 0 |
| 20.09.2022 15:00 - 16:00 | 400 | 0 | 0 | 0 |
| 20.09.2022 16:00 - 17:00 | 400 | 0 | 0 | 0 |
| 20.09.2022 17:00 - 18:00 | 700 | 0 | 0 | 0 |
| 20.09.2022 18:00 - 19:00 | 700 | 0 | 0 | 0 |
| 20.09.2022 19:00 - 20:00 | 700 | 0 | 0 | 0 |
| 20.09.2022 20:00 - 21:00 | 700 | 0 | 0 | 0 |
| 20.09.2022 21:00 - 22:00 | 700 | 0 | 0 | 0 |
| 20.09.2022 22:00 - 23:00 | 700 | 0 | 0 | 0 |
| 20.09.2022 23:00 - 24:00 | 700 | 0 | 0 | 0 |
| 21.09.2022 00:00 - 01:00 | 700 | 0 | 0 | 0 |
| 21.09.2022 01:00 - 02:00 | 700 | 0 | 0 | 0 |
| 21.09.2022 02:00 - 03:00 | 1000 | 0 | 0 | 0 |
| 21.09.2022 03:00 - 04:00 | 1000 | 0 | 0 | 0 |
| 21.09.2022 04:00 - 05:00 | 1000 | 0 | 0 | 0 |
| 21.09.2022 05:00 - 06:00 | 1000 | 0 | 0 | 0 |
| 21.09.2022 06:00 - 07:00 | 1 | 0 | 0 | 0 |
| 21.09.2022 07:00 - 08:00 | 300 | 0 | 0 | 0 |
| 21.09.2022 08:00 - 09:00 | 300 | 0 | 0 | 0 |
| 21.09.2022 09:00 - 10:00 | 300 | 0 | 0 | 0 |
| 21.09.2022 10:00 - 11:00 | 300 | 0 | 0 | 0 |
| 21.09.2022 11:00 - 12:00 | 500 | 0 | 0 | 0 |
| 21.09.2022 12:00 - 13:00 | 500 | 0 | 0 | 0 |
| 21.09.2022 13:00 - 14:00 | 500 | 0 | 0 | 0 |
| 21.09.2022 14:00 - 15:00 | 500 | 0 | 0 | 0 |
| 21.09.2022 15:00 - 16:00 | 500 | 0 | 0 | 0 |
| 21.09.2022 16:00 - 17:00 | 500 | 0 | 0 | 0 |
| 21.09.2022 17:00 - 18:00 | 500 | 0 | 0 | 0 |
| 21.09.2022 18:00 - 19:00 | 500 | 0 | 0 | 0 |
| 21.09.2022 19:00 - 20:00 | 500 | 0 | 0 | 0 |
| 21.09.2022 20:00 - 21:00 | 500 | 0 | 0 | 0 |
| 21.09.2022 21:00 - 22:00 | 500 | 0 | 0 | 0 |
| 21.09.2022 22:00 - 23:00 | 500 | 0 | 0 | 0 |
| 21.09.2022 23:00 - 24:00 | 500 | 0 | 0 | 0 |
| 22.09.2022 00:00 - 01:00 | 500 | 0 | 0 | 0 |
| 22.09.2022 01:00 - 02:00 | 500 | 0 | 0 | 0 |
| 22.09.2022 02:00 - 03:00 | 500 | 0 | 0 | 0 |
| 22.09.2022 03:00 - 04:00 | 500 | 0 | 0 | 0 |
| 22.09.2022 04:00 - 05:00 | 500 | 0 | 0 | 0 |
| 22.09.2022 05:00 - 06:00 | 500 | 0 | 0 | 0 |
| 22.09.2022 06:00 - 07:00 | 0 | 0 | 0 | 0 |
| 22.09.2022 07:00 - 08:00 | 0 | 0 | 0 | 0 |
| 22.09.2022 08:00 - 09:00 | 0 | 0 | 0 | 0 |
| 22.09.2022 09:00 - 10:00 | 0 | 0 | 0 | 0 |
| 22.09.2022 10:00 - 11:00 | 0 | 0 | 0 | 0 |
| 22.09.2022 11:00 - 12:00 | 0 | 0 | 0 | 0 |
| 22.09.2022 12:00 - 13:00 | 0 | 0 | 0 | 0 |
| 22.09.2022 13:00 - 14:00 | 0 | 0 | 0 | 0 |
| 22.09.2022 14:00 - 15:00 | 0 | 0 | 0 | 0 |
| 22.09.2022 15:00 - 16:00 | 0 | 0 | 0 | 0 |
| 22.09.2022 16:00 - 17:00 | 0 | 0 | 0 | 0 |
| 22.09.2022 17:00 - 18:00 | 0 | 0 | 0 | 0 |
| 22.09.2022 18:00 - 19:00 | 0 | 0 | 0 | 0 |
| 22.09.2022 19:00 - 20:00 | 0 | 0 | 0 | 0 |
| 22.09.2022 20:00 - 21:00 | 0 | 0 | 0 | 0 |
| 22.09.2022 21:00 - 22:00 | 0 | 0 | 0 | 0 |
| 22.09.2022 22:00 - 23:00 | 0 | 0 | 0 | 0 |
| 22.09.2022 23:00 - 24:00 | 0 | 0 | 0 | 0 |
| 23.09.2022 00:00 - 01:00 | 0 | 0 | 0 | 0 |
| 23.09.2022 01:00 - 02:00 | 0 | 0 | 0 | 0 |
| 23.09.2022 02:00 - 03:00 | 0 | 0 | 0 | 0 |
| 23.09.2022 03:00 - 04:00 | 0 | 0 | 0 | 0 |
| 23.09.2022 04:00 - 05:00 | 0 | 0 | 0 | 0 |
| 23.09.2022 05:00 - 06:00 | 0 | 0 | 0 | 0 |
| 23.09.2022 06:00 - 07:00 | 0 | 0 | 0 | 0 |
| 23.09.2022 07:00 - 08:00 | 0 | 0 | 0 | 0 |
| 23.09.2022 08:00 - 09:00 | 0 | 0 | 0 | 0 |
| 23.09.2022 09:00 - 10:00 | 0 | 0 | 0 | 0 |
| 23.09.2022 10:00 - 11:00 | 0 | 0 | 0 | 0 |
| 23.09.2022 11:00 - 12:00 | 0 | 0 | 0 | 0 |
| 23.09.2022 12:00 - 13:00 | 0 | 0 | 0 | 0 |
| 23.09.2022 13:00 - 14:00 | 0 | 0 | 0 | 0 |
| 23.09.2022 14:00 - 15:00 | 0 | 0 | 0 | 0 |
| 23.09.2022 15:00 - 16:00 | 0 | 0 | 0 | 0 |
| 23.09.2022 16:00 - 17:00 | 0 | 0 | 0 | 0 |
| 23.09.2022 17:00 - 18:00 | 0 | 0 | 0 | 0 |
| 23.09.2022 18:00 - 19:00 | 0 | 0 | 0 | 0 |
| 23.09.2022 19:00 - 20:00 | 0 | 0 | 0 | 0 |
| 23.09.2022 20:00 - 21:00 | 0 | 0 | 0 | 0 |
| 23.09.2022 21:00 - 22:00 | 0 | 0 | 0 | 0 |
| 23.09.2022 22:00 - 23:00 | 0 | 0 | 0 | 0 |
| 23.09.2022 23:00 - 24:00 | 0 | 0 | 0 | 0 |
| 24.09.2022 00:00 - 01:00 | 0 | 0 | 0 | 0 |
| 24.09.2022 01:00 - 02:00 | 0 | 0 | 0 | 0 |
| 24.09.2022 02:00 - 03:00 | 0 | 0 | 0 | 0 |
| 24.09.2022 03:00 - 04:00 | 0 | 0 | 0 | 0 |
| 24.09.2022 04:00 - 05:00 | 0 | 0 | 0 | 0 |
| 24.09.2022 05:00 - 06:00 | 0 | 0 | 0 | 0 |
| 24.09.2022 06:00 - 07:00 | 0 | 0 | 0 | 0 |
| 24.09.2022 07:00 - 08:00 | 0 | 0 | 0 | 0 |
| 24.09.2022 08:00 - 09:00 | 0 | 0 | 0 | 0 |
| 24.09.2022 09:00 - 10:00 | 0 | 0 | 0 | 0 |
| 24.09.2022 10:00 - 11:00 | 0 | 0 | 0 | 0 |
| 24.09.2022 11:00 - 12:00 | 0 | 0 | 0 | 0 |
| 24.09.2022 12:00 - 13:00 | 0 | 0 | 0 | 0 |
| 24.09.2022 13:00 - 14:00 | 0 | 0 | 0 | 0 |
| 24.09.2022 14:00 - 15:00 | 0 | 0 | 0 | 0 |
| 24.09.2022 15:00 - 16:00 | 0 | 0 | 0 | 0 |
| 24.09.2022 16:00 - 17:00 | 0 | 0 | 0 | 0 |
| 24.09.2022 17:00 - 18:00 | 0 | 0 | 0 | 0 |
| 24.09.2022 18:00 - 19:00 | 0 | 0 | 0 | 0 |
| 24.09.2022 19:00 - 20:00 | 0 | 0 | 0 | 0 |
| 24.09.2022 20:00 - 21:00 | 0 | 0 | 0 | 0 |
| 24.09.2022 21:00 - 22:00 | 0 | 0 | 0 | 0 |
| 24.09.2022 22:00 - 23:00 | 0 | 0 | 0 | 0 |
| 24.09.2022 23:00 - 24:00 | 0 | -500 | 0 | 0 |
| 25.09.2022 00:00 - 01:00 | 0 | -500 | 0 | 0 |
| 25.09.2022 01:00 - 02:00 | 0 | -800 | 0 | 0 |
| 25.09.2022 02:00 - 03:00 | 0 | -800 | 0 | 0 |
| 25.09.2022 03:00 - 04:00 | 0 | -1000 | 0 | 0 |
| 25.09.2022 04:00 - 05:00 | 0 | -1000 | 0 | 0 |
| 25.09.2022 05:00 - 06:00 | 0 | -1000 | 0 | 0 |
| 25.09.2022 06:00 - 07:00 | 0 | 0 | 0 | 0 |
| 25.09.2022 07:00 - 08:00 | 0 | 0 | 0 | 0 |
| 25.09.2022 08:00 - 09:00 | 0 | 0 | 0 | 0 |
| 25.09.2022 09:00 - 10:00 | 0 | 0 | 0 | 0 |
| 25.09.2022 10:00 - 11:00 | 0 | 0 | 0 | 0 |
| 25.09.2022 11:00 - 12:00 | 0 | 0 | 0 | 0 |
| 25.09.2022 12:00 - 13:00 | 0 | 0 | 0 | 0 |
| 25.09.2022 13:00 - 14:00 | 0 | 0 | 0 | 0 |
| 25.09.2022 14:00 - 15:00 | 0 | -400 | 0 | 0 |
| 25.09.2022 15:00 - 16:00 | 0 | -400 | 0 | 0 |
| 25.09.2022 16:00 - 17:00 | 0 | -400 | 0 | 0 |
| 25.09.2022 17:00 - 18:00 | 0 | -400 | 0 | 0 |
| 25.09.2022 18:00 - 19:00 | 0 | -400 | 0 | 0 |
| 25.09.2022 19:00 - 20:00 | 0 | -400 | 0 | 0 |
| 25.09.2022 20:00 - 21:00 | 0 | -400 | 0 | 0 |
| 25.09.2022 21:00 - 22:00 | 0 | -400 | 0 | 0 |
| 25.09.2022 22:00 - 23:00 | 0 | -1000 | 0 | 0 |
| 25.09.2022 23:00 - 24:00 | 0 | -1000 | 0 | 0 |
| 26.09.2022 00:00 - 01:00 | 0 | -1000 | 0 | 0 |
| 26.09.2022 01:00 - 02:00 | 0 | -1000 | 0 | 0 |
| 26.09.2022 02:00 - 03:00 | 0 | -1000 | 0 | 0 |
| 26.09.2022 03:00 - 04:00 | 0 | -1000 | 0 | 0 |
| 26.09.2022 04:00 - 05:00 | 0 | -1000 | 0 | 0 |
| 26.09.2022 05:00 - 06:00 | 0 | -1000 | 0 | 0 |
| 26.09.2022 06:00 - 07:00 | 0 | 0 | 0 | 0 |
| 26.09.2022 07:00 - 08:00 | 0 | 0 | 0 | 0 |
| 26.09.2022 08:00 - 09:00 | 0 | 0 | 0 | 0 |
| 26.09.2022 09:00 - 10:00 | 0 | 0 | 0 | 0 |
| 26.09.2022 10:00 - 11:00 | 0 | 0 | 0 | 0 |
| 26.09.2022 11:00 - 12:00 | 0 | 0 | 0 | 0 |
| 26.09.2022 12:00 - 13:00 | 0 | 0 | 0 | 0 |
| 26.09.2022 13:00 - 14:00 | 0 | 0 | 0 | 0 |
| 26.09.2022 14:00 - 15:00 | 0 | 0 | 0 | 0 |
| 26.09.2022 15:00 - 16:00 | 0 | 0 | 0 | 0 |
| 26.09.2022 16:00 - 17:00 | 0 | 0 | 0 | 0 |
| 26.09.2022 17:00 - 18:00 | 0 | 0 | 0 | 0 |
| 26.09.2022 18:00 - 19:00 | 0 | 0 | 0 | 0 |
| 26.09.2022 19:00 - 20:00 | 0 | 0 | 0 | 0 |
| 26.09.2022 20:00 - 21:00 | 0 | 0 | 0 | 0 |
| 26.09.2022 21:00 - 22:00 | 0 | 0 | 0 | 0 |
| 26.09.2022 22:00 - 23:00 | 0 | 0 | 0 | 0 |
| 26.09.2022 23:00 - 24:00 | 0 | 0 | 0 | 0 |
| 27.09.2022 00:00 - 01:00 | 0 | -600 | 0 | 0 |
| 27.09.2022 01:00 - 02:00 | 0 | -600 | 0 | 0 |
| 27.09.2022 02:00 - 03:00 | 0 | -600 | 0 | 0 |
| 27.09.2022 03:00 - 04:00 | 0 | -600 | 0 | 0 |
| 27.09.2022 04:00 - 05:00 | 0 | -600 | 0 | 0 |
| 27.09.2022 05:00 - 06:00 | 0 | -600 | 0 | 0 |
| 27.09.2022 06:00 - 07:00 | 0 | 0 | 0 | 0 |
| 27.09.2022 07:00 - 08:00 | 0 | 0 | 0 | 0 |
| 27.09.2022 08:00 - 09:00 | 0 | 0 | 0 | 0 |
| 27.09.2022 09:00 - 10:00 | 0 | 0 | 0 | 0 |
| 27.09.2022 10:00 - 11:00 | 0 | 0 | 0 | 0 |
| 27.09.2022 11:00 - 12:00 | 0 | 0 | 0 | 0 |
| 27.09.2022 12:00 - 13:00 | 0 | 0 | 0 | 0 |
| 27.09.2022 13:00 - 14:00 | 0 | 0 | 0 | 0 |
| 27.09.2022 14:00 - 15:00 | 0 | 0 | 0 | 0 |
| 27.09.2022 15:00 - 16:00 | 0 | 0 | 0 | 0 |
| 27.09.2022 16:00 - 17:00 | 0 | 0 | 0 | 0 |
| 27.09.2022 17:00 - 18:00 | 0 | 0 | 0 | 0 |
| 27.09.2022 18:00 - 19:00 | 0 | 0 | 0 | 0 |
| 27.09.2022 19:00 - 20:00 | 0 | 0 | 0 | 0 |
| 27.09.2022 20:00 - 21:00 | 0 | 0 | 0 | 0 |
| 27.09.2022 21:00 - 22:00 | 0 | 0 | 0 | 0 |
| 27.09.2022 22:00 - 23:00 | 0 | 0 | 0 | 0 |
| 27.09.2022 23:00 - 24:00 | 0 | -600 | 0 | 0 |
| 28.09.2022 00:00 - 01:00 | 0 | -600 | 0 | 0 |
| 28.09.2022 01:00 - 02:00 | 0 | -600 | 0 | 0 |
| 28.09.2022 02:00 - 03:00 | 0 | -600 | 0 | 0 |
| 28.09.2022 03:00 - 04:00 | 0 | -600 | 0 | 0 |
| 28.09.2022 04:00 - 05:00 | 0 | -600 | 0 | 0 |
| 28.09.2022 05:00 - 06:00 | 0 | -600 | 0 | 0 |
| 28.09.2022 06:00 - 07:00 | 0 | 0 | 0 | 0 |
| 28.09.2022 07:00 - 08:00 | 0 | 0 | 0 | 0 |
| 28.09.2022 08:00 - 09:00 | 0 | 0 | 0 | 0 |
| 28.09.2022 09:00 - 10:00 | 0 | 0 | 0 | 0 |
| 28.09.2022 10:00 - 11:00 | 0 | 0 | 0 | 0 |
| 28.09.2022 11:00 - 12:00 | 0 | 0 | 0 | 0 |
| 28.09.2022 12:00 - 13:00 | 0 | 0 | 0 | 0 |
| 28.09.2022 13:00 - 14:00 | 0 | 0 | 0 | 0 |
| 28.09.2022 14:00 - 15:00 | 0 | 0 | 0 | 0 |
| 28.09.2022 15:00 - 16:00 | 0 | 0 | 0 | 0 |
| 28.09.2022 16:00 - 17:00 | 0 | 0 | 0 | 0 |
| 28.09.2022 17:00 - 18:00 | 0 | 0 | 0 | 0 |
| 28.09.2022 18:00 - 19:00 | 0 | 0 | 0 | 0 |
| 28.09.2022 19:00 - 20:00 | 0 | 0 | 0 | 0 |
| 28.09.2022 20:00 - 21:00 | 0 | 0 | 0 | 0 |
| 28.09.2022 21:00 - 22:00 | 0 | 0 | 0 | 0 |
| 28.09.2022 22:00 - 23:00 | 0 | 0 | 0 | 0 |
| 28.09.2022 23:00 - 24:00 | 0 | 0 | 0 | 0 |
| 29.09.2022 00:00 - 01:00 | 0 | 0 | 0 | 0 |
| 29.09.2022 01:00 - 02:00 | 0 | 0 | 0 | 0 |
| 29.09.2022 02:00 - 03:00 | 0 | 0 | 0 | 0 |
| 29.09.2022 03:00 - 04:00 | 0 | 0 | 0 | 0 |
| 29.09.2022 04:00 - 05:00 | 0 | 0 | 0 | 0 |
| 29.09.2022 05:00 - 06:00 | 0 | 0 | 0 | 0 |
| 29.09.2022 06:00 - 07:00 | 0 | 0 | 0 | 0 |
| 29.09.2022 07:00 - 08:00 | 0 | 0 | 0 | 0 |
| 29.09.2022 08:00 - 09:00 | 0 | 0 | 0 | 0 |
| 29.09.2022 09:00 - 10:00 | 0 | 0 | 0 | 0 |
| 29.09.2022 10:00 - 11:00 | 0 | 0 | 0 | 0 |
| 29.09.2022 11:00 - 12:00 | 0 | 0 | 0 | 0 |
| 29.09.2022 12:00 - 13:00 | 0 | 0 | 0 | 0 |
| 29.09.2022 13:00 - 14:00 | 0 | 0 | 0 | 0 |
| 29.09.2022 14:00 - 15:00 | 0 | 0 | 0 | 0 |
| 29.09.2022 15:00 - 16:00 | 0 | 0 | 0 | 0 |
| 29.09.2022 16:00 - 17:00 | 0 | 0 | 0 | 0 |
| 29.09.2022 17:00 - 18:00 | 0 | 0 | 0 | 0 |
| 29.09.2022 18:00 - 19:00 | 0 | 0 | 0 | 0 |
| 29.09.2022 19:00 - 20:00 | 0 | 0 | 0 | 0 |
| 29.09.2022 20:00 - 21:00 | 0 | -300 | 0 | 0 |
| 29.09.2022 21:00 - 22:00 | 0 | -300 | 0 | 0 |
| 29.09.2022 22:00 - 23:00 | 0 | -300 | 0 | 0 |
| 29.09.2022 23:00 - 24:00 | 0 | -802 | 0 | 0 |
| 30.09.2022 00:00 - 01:00 | 0 | -900 | 0 | 0 |
| 30.09.2022 01:00 - 02:00 | 0 | -900 | 0 | 0 |
| 30.09.2022 02:00 - 03:00 | 0 | -900 | 0 | 0 |
| 30.09.2022 03:00 - 04:00 | 0 | -900 | 0 | 0 |
| 30.09.2022 04:00 - 05:00 | 0 | -900 | 0 | 0 |
| 30.09.2022 05:00 - 06:00 | 0 | -900 | 0 | 0 |
| 30.09.2022 06:00 - 07:00 | 0 | 0 | 0 | 0 |
| 30.09.2022 07:00 - 08:00 | 0 | 0 | 0 | 0 |
| 30.09.2022 08:00 - 09:00 | 0 | 0 | 0 | 0 |
| 30.09.2022 09:00 - 10:00 | 0 | 0 | 0 | 0 |
| 30.09.2022 10:00 - 11:00 | 0 | 0 | 0 | 0 |
| 30.09.2022 11:00 - 12:00 | 0 | 0 | 0 | 0 |
| 30.09.2022 12:00 - 13:00 | 0 | 0 | 0 | 0 |
| 30.09.2022 13:00 - 14:00 | 0 | 0 | 0 | 0 |
| 30.09.2022 14:00 - 15:00 | 0 | 0 | 0 | 0 |
| 30.09.2022 15:00 - 16:00 | 0 | 0 | 0 | 0 |
| 30.09.2022 16:00 - 17:00 | 0 | 0 | 0 | 0 |
| 30.09.2022 17:00 - 18:00 | 0 | 0 | 0 | 0 |
| 30.09.2022 18:00 - 19:00 | 0 | 0 | 0 | 0 |
| 30.09.2022 19:00 - 20:00 | 0 | 0 | 0 | 0 |
| 30.09.2022 20:00 - 21:00 | 0 | 0 | 0 | 0 |
| 30.09.2022 21:00 - 22:00 | 0 | -500 | 0 | 0 |
| 30.09.2022 22:00 - 23:00 | 0 | -500 | 0 | 0 |
| 30.09.2022 23:00 - 24:00 | 0 | -500 | 0 | 0 |
| 01.10.2022 00:00 - 01:00 | 0 | -500 | 0 | 0 |
| 01.10.2022 01:00 - 02:00 | 0 | -500 | 0 | 0 |
| 01.10.2022 02:00 - 03:00 | 0 | -500 | 0 | 0 |
| 01.10.2022 03:00 - 04:00 | 0 | -500 | 0 | 0 |
| 01.10.2022 04:00 - 05:00 | 0 | -500 | 0 | 0 |
| 01.10.2022 05:00 - 06:00 | 0 | -500 | 0 | 0 |